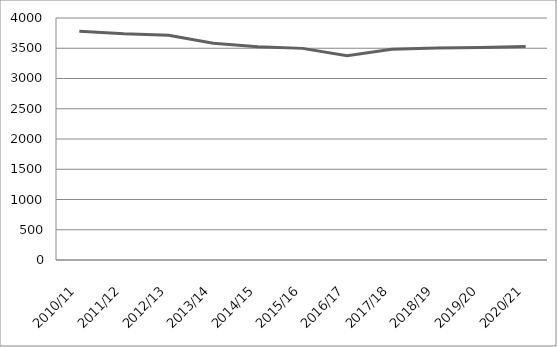
| Category | Series 0 |
|---|---|
| 2010/11 | 3783 |
| 2011/12 | 3738 |
| 2012/13 | 3713 |
| 2013/14 | 3581 |
| 2014/15 | 3525 |
| 2015/16 | 3498 |
| 2016/17 | 3376 |
| 2017/18 | 3485 |
| 2018/19 | 3505 |
| 2019/20 | 3511 |
| 2020/21 | 3529 |